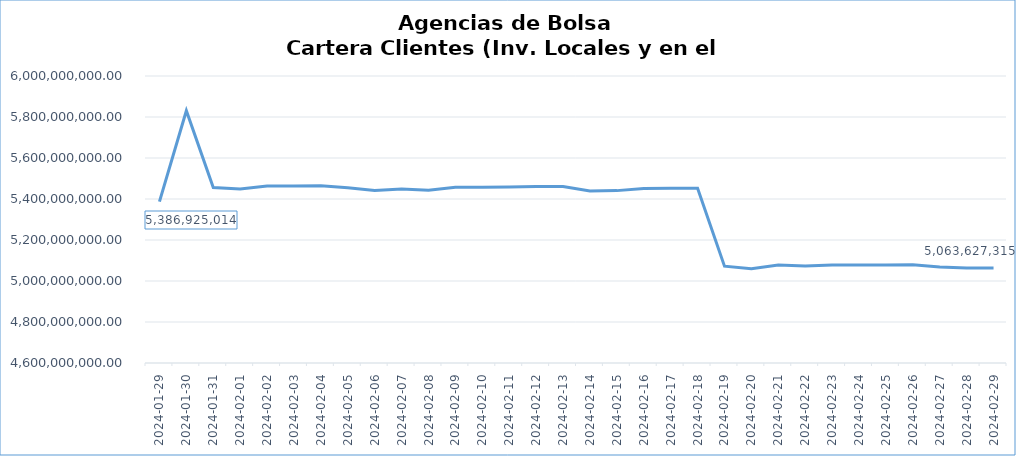
| Category | TOTAL |
|---|---|
| 2024-01-29 | 5386925014.076 |
| 2024-01-30 | 5830691714.199 |
| 2024-01-31 | 5455637789.39 |
| 2024-02-01 | 5448714059.206 |
| 2024-02-02 | 5463529295.108 |
| 2024-02-03 | 5463578963.298 |
| 2024-02-04 | 5464034622.248 |
| 2024-02-05 | 5454490347.197 |
| 2024-02-06 | 5441750285.78 |
| 2024-02-07 | 5448832611.175 |
| 2024-02-08 | 5442764266.431 |
| 2024-02-09 | 5457642334.592 |
| 2024-02-10 | 5457735758.352 |
| 2024-02-11 | 5458045545.822 |
| 2024-02-12 | 5460564821.442 |
| 2024-02-13 | 5460954552.702 |
| 2024-02-14 | 5438763801.752 |
| 2024-02-15 | 5440869178.138 |
| 2024-02-16 | 5451769919.88 |
| 2024-02-17 | 5451907199.72 |
| 2024-02-18 | 5452346905.27 |
| 2024-02-19 | 5072445273.34 |
| 2024-02-20 | 5059753194.74 |
| 2024-02-21 | 5077667428.275 |
| 2024-02-22 | 5072676714.872 |
| 2024-02-23 | 5077554298.779 |
| 2024-02-24 | 5077986695.879 |
| 2024-02-25 | 5077668946.339 |
| 2024-02-26 | 5079666215.346 |
| 2024-02-27 | 5067942448.378 |
| 2024-02-28 | 5063257935.762 |
| 2024-02-29 | 5063627315.461 |